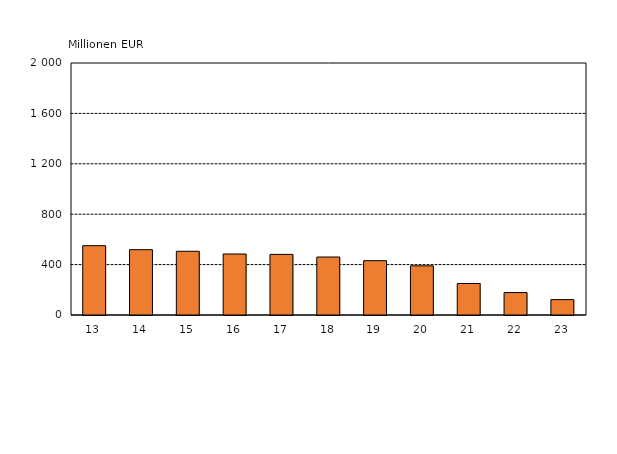
| Category | Series 0 |
|---|---|
| 13 | 550.12 |
| 14 | 518.38 |
| 15 | 505.719 |
| 16 | 484.075 |
| 17 | 481.131 |
| 18 | 460.188 |
| 19 | 431.049 |
| 20 | 390.179 |
| 21 | 250.28 |
| 22 | 178.194 |
| 23 | 122.19 |